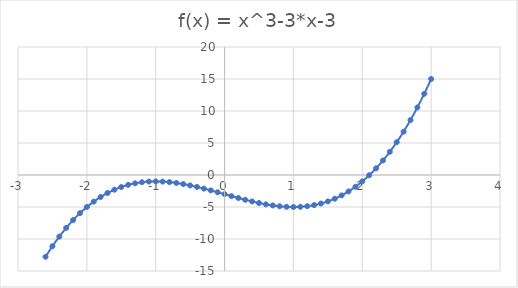
| Category | Series 0 |
|---|---|
| -2.6 | -12.776 |
| -2.5 | -11.125 |
| -2.4 | -9.624 |
| -2.3 | -8.267 |
| -2.1999999999999997 | -7.048 |
| -2.0999999999999996 | -5.961 |
| -1.9999999999999996 | -5 |
| -1.8999999999999995 | -4.159 |
| -1.7999999999999994 | -3.432 |
| -1.6999999999999993 | -2.813 |
| -1.5999999999999992 | -2.296 |
| -1.4999999999999991 | -1.875 |
| -1.399999999999999 | -1.544 |
| -1.299999999999999 | -1.297 |
| -1.1999999999999988 | -1.128 |
| -1.0999999999999988 | -1.031 |
| -0.9999999999999988 | -1 |
| -0.8999999999999988 | -1.029 |
| -0.7999999999999988 | -1.112 |
| -0.6999999999999988 | -1.243 |
| -0.5999999999999989 | -1.416 |
| -0.4999999999999989 | -1.625 |
| -0.3999999999999989 | -1.864 |
| -0.29999999999999893 | -2.127 |
| -0.19999999999999893 | -2.408 |
| -0.09999999999999892 | -2.701 |
| 1.0824674490095276e-15 | -3 |
| 0.10000000000000109 | -3.299 |
| 0.2000000000000011 | -3.592 |
| 0.3000000000000011 | -3.873 |
| 0.40000000000000113 | -4.136 |
| 0.5000000000000011 | -4.375 |
| 0.6000000000000011 | -4.584 |
| 0.7000000000000011 | -4.757 |
| 0.800000000000001 | -4.888 |
| 0.900000000000001 | -4.971 |
| 1.000000000000001 | -5 |
| 1.1000000000000012 | -4.969 |
| 1.2000000000000013 | -4.872 |
| 1.3000000000000014 | -4.703 |
| 1.4000000000000015 | -4.456 |
| 1.5000000000000016 | -4.125 |
| 1.6000000000000016 | -3.704 |
| 1.7000000000000017 | -3.187 |
| 1.8000000000000018 | -2.568 |
| 1.900000000000002 | -1.841 |
| 2.0000000000000018 | -1 |
| 2.100000000000002 | -0.039 |
| 2.200000000000002 | 1.048 |
| 2.300000000000002 | 2.267 |
| 2.400000000000002 | 3.624 |
| 2.500000000000002 | 5.125 |
| 2.6000000000000023 | 6.776 |
| 2.7000000000000024 | 8.583 |
| 2.8000000000000025 | 10.552 |
| 2.9000000000000026 | 12.689 |
| 3.0000000000000027 | 15 |